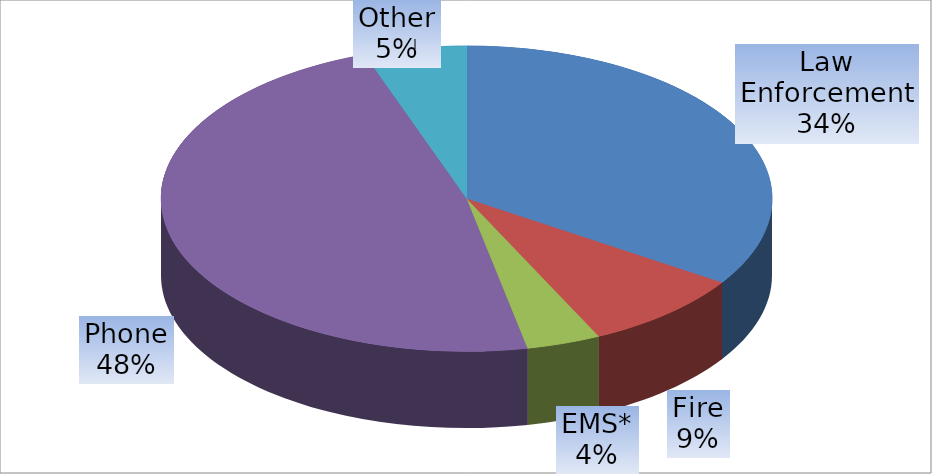
| Category | Series 0 |
|---|---|
| Law Enforcement | 60289 |
| Fire | 15201 |
| EMS* | 6897 |
| Phone | 84125 |
| Other | 9519 |